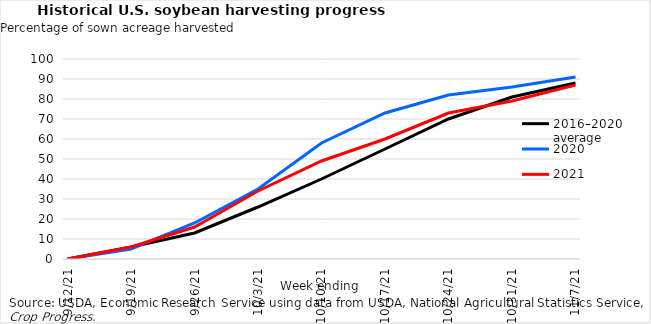
| Category | 2016–2020 average | 2020 | 2021 |
|---|---|---|---|
| 9/12/21 | 0 | 0 | 0 |
| 9/19/21 | 6 | 5 | 6 |
| 9/26/21 | 13 | 18 | 16 |
| 10/3/21 | 26 | 35 | 34 |
| 10/10/21 | 40 | 58 | 49 |
| 10/17/21 | 55 | 73 | 60 |
| 10/24/21 | 70 | 82 | 73 |
| 10/31/21 | 81 | 86 | 79 |
| 11/7/21 | 88 | 91 | 87 |